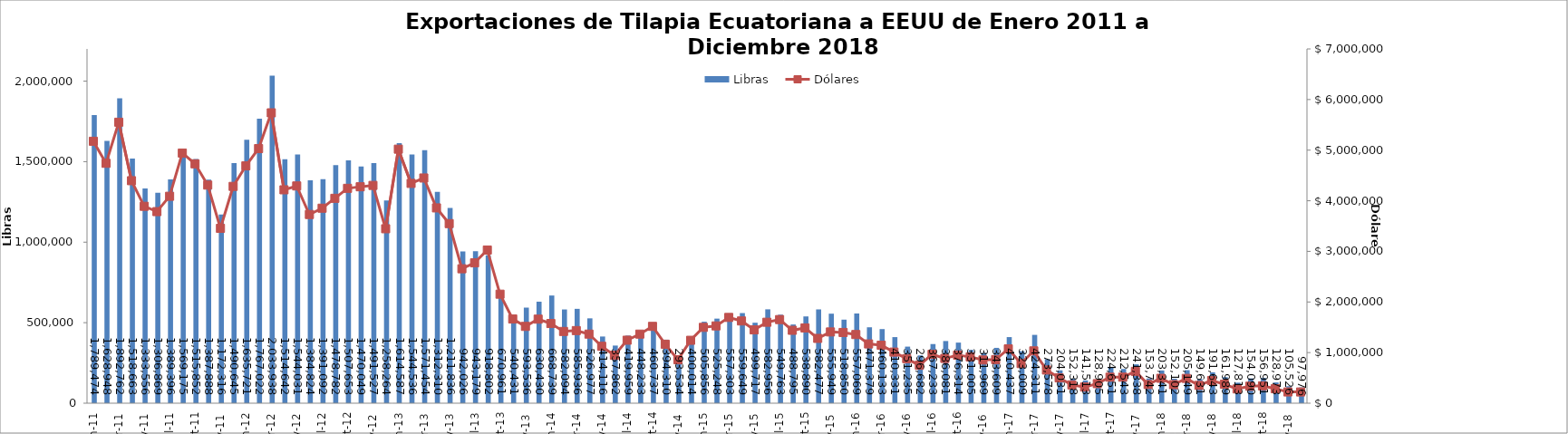
| Category | Libras  |
|---|---|
| 2011-01-01 | 1789473.82 |
| 2011-02-01 | 1628948.076 |
| 2011-03-01 | 1892761.535 |
| 2011-04-01 | 1518662.961 |
| 2011-05-01 | 1333555.926 |
| 2011-06-01 | 1306869.243 |
| 2011-07-01 | 1389396.24 |
| 2011-08-01 | 1569174.756 |
| 2011-09-01 | 1515852.096 |
| 2011-10-01 | 1387888.293 |
| 2011-11-01 | 1172315.891 |
| 2011-12-01 | 1490644.699 |
| 2012-01-01 | 1635720.607 |
| 2012-02-01 | 1767022.174 |
| 2012-03-01 | 2033937.505 |
| 2012-04-01 | 1514641.77 |
| 2012-05-01 | 1544031.293 |
| 2012-06-01 | 1384823.899 |
| 2012-07-01 | 1391091.577 |
| 2012-08-01 | 1478781.747 |
| 2012-09-01 | 1507653.188 |
| 2012-10-01 | 1470049.326 |
| 2012-11-01 | 1491526.539 |
| 2012-12-01 | 1258264 |
| 2013-01-01 | 1614587 |
| 2013-02-01 | 1544536.146 |
| 2013-03-01 | 1571454.312 |
| 2013-04-01 | 1312310.196 |
| 2013-05-01 | 1211835.551 |
| 2013-06-01 | 942025.58 |
| 2013-07-01 | 943178.586 |
| 2013-08-01 | 918802.324 |
| 2013-09-01 | 670961.192 |
| 2013-10-01 | 540431.235 |
| 2013-11-01 | 593535.64 |
| 2013-12-01 | 630429.621 |
| 2014-01-01 | 668739 |
| 2014-02-01 | 582093.766 |
| 2014-03-01 | 585936.383 |
| 2014-04-01 | 526976.561 |
| 2014-05-01 | 414116.473 |
| 2014-06-01 | 357861.695 |
| 2014-07-01 | 419958.663 |
| 2014-08-01 | 448233 |
| 2014-09-01 | 460737.149 |
| 2014-10-01 | 394310.347 |
| 2014-11-01 | 293533.672 |
| 2014-12-01 | 400013.647 |
| 2015-01-01 | 505856.493 |
| 2015-02-01 | 525248 |
| 2015-03-01 | 557303.039 |
| 2015-04-01 | 559648.733 |
| 2015-05-01 | 499716.682 |
| 2015-06-01 | 582955.764 |
| 2015-07-01 | 549763.307 |
| 2015-08-01 | 488795.094 |
| 2015-09-01 | 538890.219 |
| 2015-10-01 | 582477.366 |
| 2015-11-01 | 555949.414 |
| 2015-12-01 | 518850.405 |
| 2016-01-01 | 557069.351 |
| 2016-02-01 | 471378.754 |
| 2016-03-01 | 460133.089 |
| 2016-04-01 | 410331.175 |
| 2016-05-01 | 351235 |
| 2016-06-01 | 296682 |
| 2016-07-01 | 367233.45 |
| 2016-08-01 | 386080.575 |
| 2016-09-01 | 376314.197 |
| 2016-10-01 | 331005.258 |
| 2016-11-01 | 311968.537 |
| 2016-12-01 | 343608.956 |
| 2017-01-01 | 410436.996 |
| 2017-02-01 | 323009.174 |
| 2017-03-01 | 424310.544 |
| 2017-04-01 | 273577.632 |
| 2017-05-01 | 204031.321 |
| 2017-06-01 | 152318.019 |
| 2017-07-01 | 141513.274 |
| 2017-08-01 | 128905.167 |
| 2017-09-01 | 224650.945 |
| 2017-10-01 | 212543.281 |
| 2017-11-01 | 241337.562 |
| 2017-12-01 | 153742.19 |
| 2018-01-01 | 203341.281 |
| 2018-02-01 | 152101.968 |
| 2018-03-01 | 205149.053 |
| 2018-04-01 | 149630.611 |
| 2018-05-01 | 191643 |
| 2018-06-01 | 161989 |
| 2018-07-01 | 127813 |
| 2018-08-01 | 154089.894 |
| 2018-09-01 | 156951.494 |
| 2018-10-01 | 128972.628 |
| 2018-11-01 | 105526.466 |
| 2018-12-01 | 97975.634 |